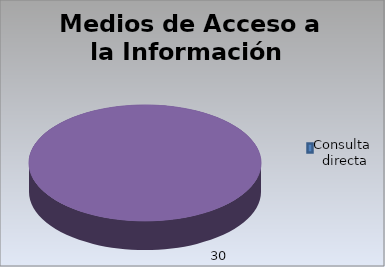
| Category | Consulta directa electrónica |
|---|---|
| 0 | 71 |